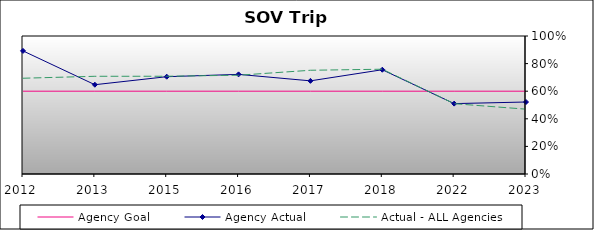
| Category | Agency Goal | Agency Actual | Actual - ALL Agencies |
|---|---|---|---|
| 2012.0 | 0.6 | 0.892 | 0.694 |
| 2013.0 | 0.6 | 0.647 | 0.708 |
| 2015.0 | 0.6 | 0.705 | 0.708 |
| 2016.0 | 0.6 | 0.722 | 0.716 |
| 2017.0 | 0.6 | 0.675 | 0.752 |
| 2018.0 | 0.6 | 0.756 | 0.759 |
| 2022.0 | 0.6 | 0.51 | 0.509 |
| 2023.0 | 0.6 | 0.522 | 0.47 |